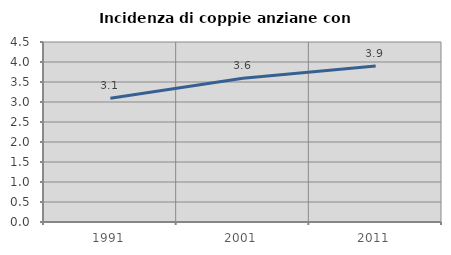
| Category | Incidenza di coppie anziane con figli |
|---|---|
| 1991.0 | 3.093 |
| 2001.0 | 3.594 |
| 2011.0 | 3.898 |